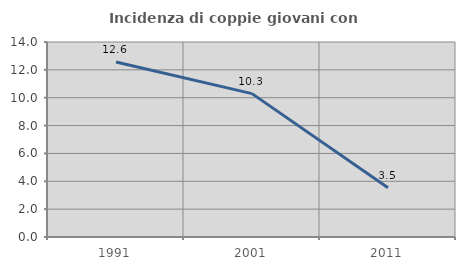
| Category | Incidenza di coppie giovani con figli |
|---|---|
| 1991.0 | 12.558 |
| 2001.0 | 10.294 |
| 2011.0 | 3.529 |